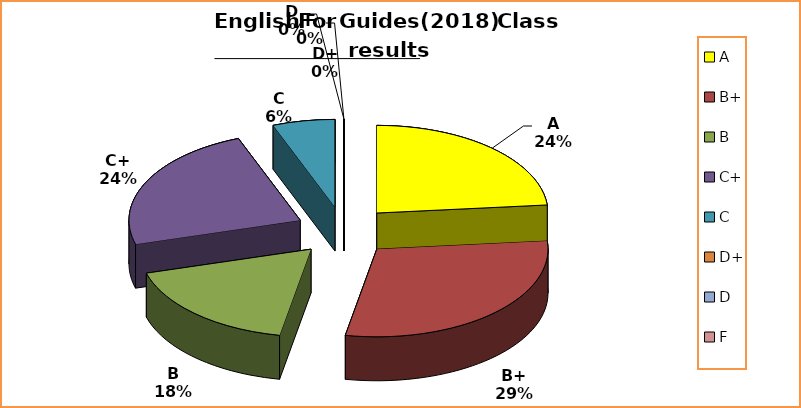
| Category | Series 0 |
|---|---|
| A | 4 |
| B+ | 5 |
| B | 3 |
| C+ | 4 |
| C | 1 |
| D+ | 0 |
| D | 0 |
| F | 0 |